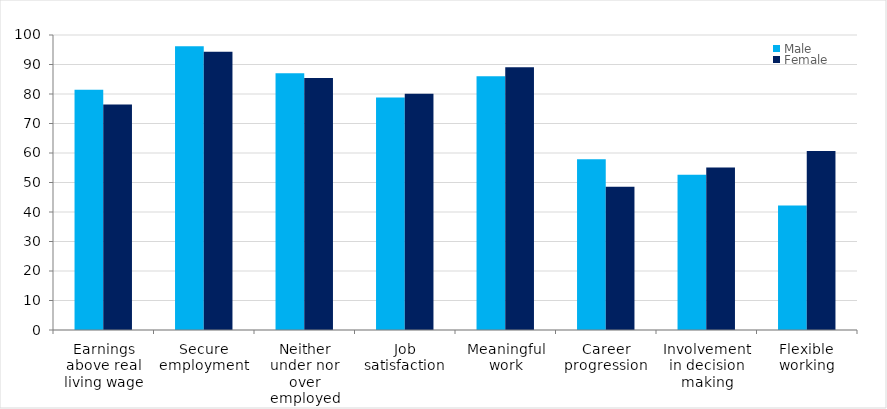
| Category | Male | Female |
|---|---|---|
| Earnings above real living wage | 81.4 | 76.4 |
| Secure employment | 96.2 | 94.3 |
| Neither under nor over employed | 87 | 85.4 |
| Job satisfaction | 78.8 | 80.1 |
| Meaningful work | 86 | 89.1 |
| Career progression | 57.9 | 48.6 |
| Involvement in decision making | 52.6 | 55.1 |
| Flexible working | 42.2 | 60.7 |